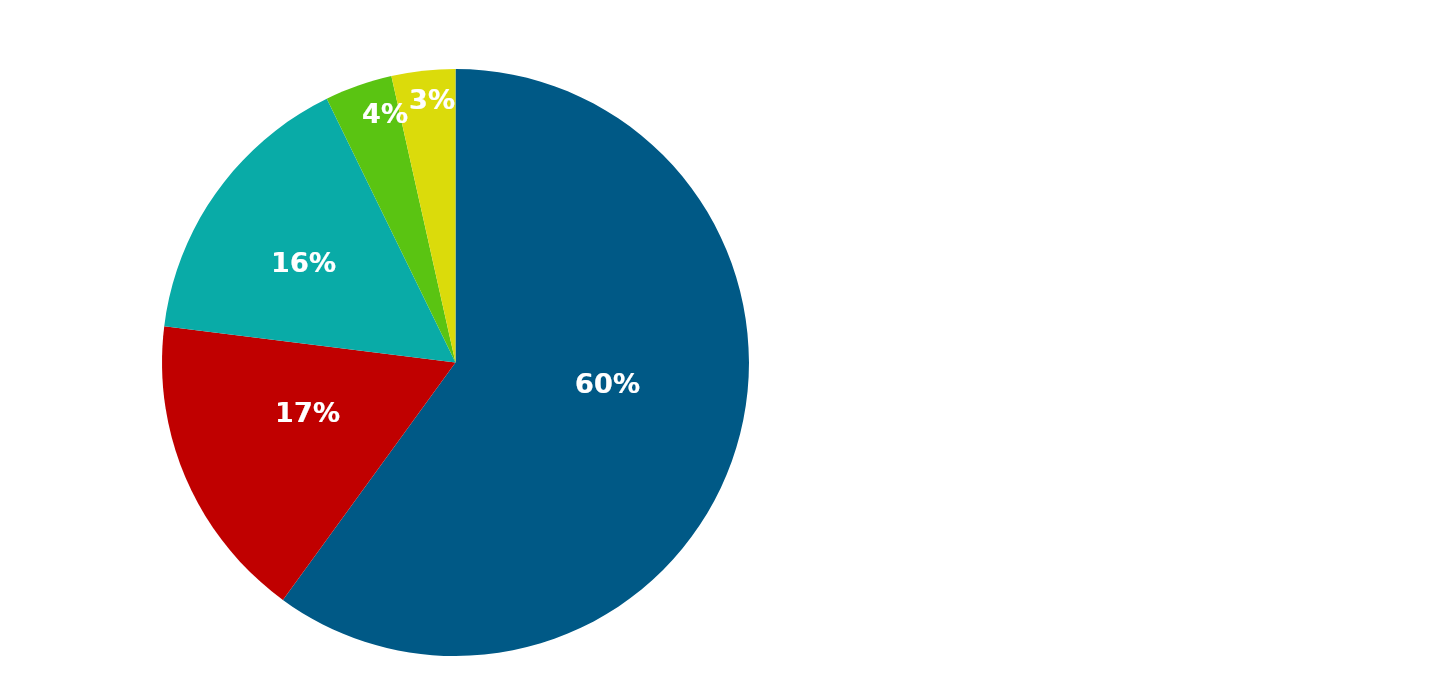
| Category | Series 0 |
|---|---|
| Salary (Includes 5 hours vacation and 5 hours sick leave) | 1800 |
| Medical Insurance ($509 the state pays) | 509 |
| Retirement * (26.33% the state pays) | 473.94 |
| Social Security ** (6.2% the state pays) | 111.6 |
| Other *** (LTD, Basic Life, Medicare, Retiree Medical) | 105.156 |